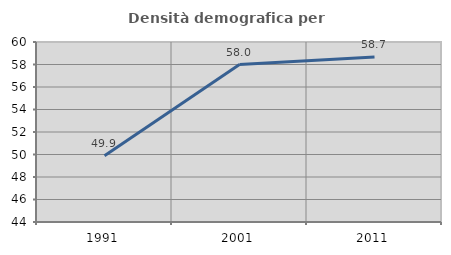
| Category | Densità demografica |
|---|---|
| 1991.0 | 49.888 |
| 2001.0 | 57.995 |
| 2011.0 | 58.675 |